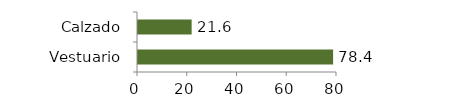
| Category | Vestuario y calzado |
|---|---|
| Vestuario | 78.433 |
| Calzado | 21.567 |